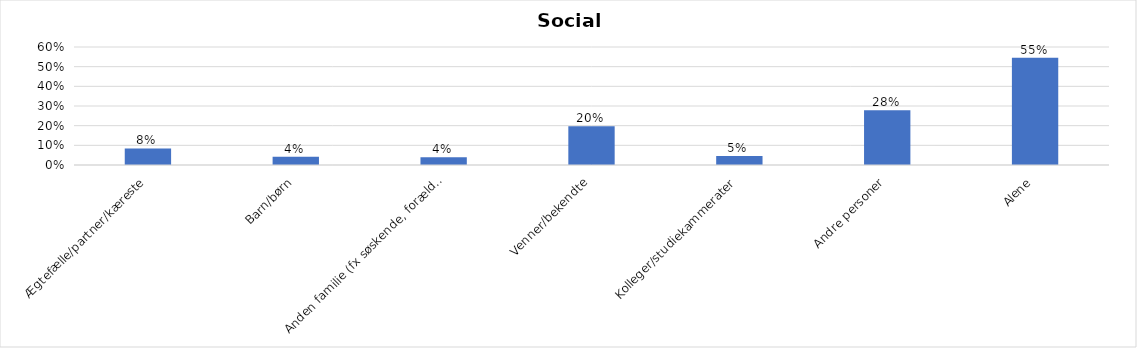
| Category | % |
|---|---|
| Ægtefælle/partner/kæreste | 0.084 |
| Barn/børn | 0.042 |
| Anden familie (fx søskende, forældre) | 0.039 |
| Venner/bekendte | 0.197 |
| Kolleger/studiekammerater | 0.046 |
| Andre personer | 0.279 |
| Alene | 0.546 |